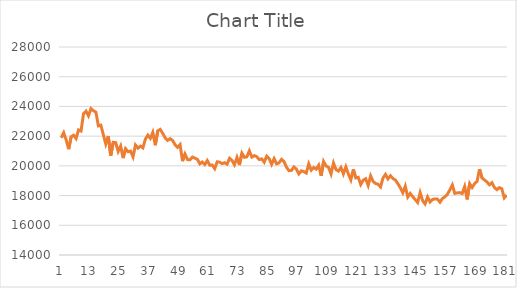
| Category | Series 0 |
|---|---|
| 0 | 21884.7 |
| 1 | 22230.5 |
| 2 | 21740.4 |
| 3 | 21124.3 |
| 4 | 21958.4 |
| 5 | 22063.1 |
| 6 | 21840 |
| 7 | 22419 |
| 8 | 22343.9 |
| 9 | 23511 |
| 10 | 23683.1 |
| 11 | 23364.8 |
| 12 | 23856 |
| 13 | 23709.1 |
| 14 | 23618.9 |
| 15 | 22693.4 |
| 16 | 22739.2 |
| 17 | 22104.9 |
| 18 | 21470.7 |
| 19 | 22006.4 |
| 20 | 20683.5 |
| 21 | 21583.3 |
| 22 | 21565 |
| 23 | 20970.9 |
| 24 | 21334.4 |
| 25 | 20523.7 |
| 26 | 21157.3 |
| 27 | 20947.8 |
| 28 | 20993.8 |
| 29 | 20603.6 |
| 30 | 21402.2 |
| 31 | 21191.8 |
| 32 | 21329.1 |
| 33 | 21211.8 |
| 34 | 21803 |
| 35 | 22071 |
| 36 | 21852.7 |
| 37 | 22255.4 |
| 38 | 21388.4 |
| 39 | 22359.1 |
| 40 | 22453.3 |
| 41 | 22187.4 |
| 42 | 21880.7 |
| 43 | 21718.1 |
| 44 | 21830.7 |
| 45 | 21706.2 |
| 46 | 21417 |
| 47 | 21249.1 |
| 48 | 21430.3 |
| 49 | 20316.7 |
| 50 | 20795.1 |
| 51 | 20423.2 |
| 52 | 20402.7 |
| 53 | 20591.7 |
| 54 | 20521.1 |
| 55 | 20439.3 |
| 56 | 20136.2 |
| 57 | 20261.7 |
| 58 | 20091.2 |
| 59 | 20357.7 |
| 60 | 20047.1 |
| 61 | 20052 |
| 62 | 19811.8 |
| 63 | 20271.5 |
| 64 | 20250 |
| 65 | 20151.5 |
| 66 | 20213.3 |
| 67 | 20110.1 |
| 68 | 20509.4 |
| 69 | 20365.7 |
| 70 | 20073.9 |
| 71 | 20570.3 |
| 72 | 20054.6 |
| 73 | 20855.9 |
| 74 | 20575.4 |
| 75 | 20607.1 |
| 76 | 21011 |
| 77 | 20590.5 |
| 78 | 20690.8 |
| 79 | 20614.6 |
| 80 | 20423 |
| 81 | 20470.3 |
| 82 | 20245.6 |
| 83 | 20646.8 |
| 84 | 20485.3 |
| 85 | 20099.9 |
| 86 | 20488.5 |
| 87 | 20138.9 |
| 88 | 20202.9 |
| 89 | 20437.8 |
| 90 | 20291.2 |
| 91 | 19913.1 |
| 92 | 19675.6 |
| 93 | 19689.9 |
| 94 | 19927.7 |
| 95 | 19779 |
| 96 | 19458.8 |
| 97 | 19667.3 |
| 98 | 19616.8 |
| 99 | 19517 |
| 100 | 20134.8 |
| 101 | 19712.7 |
| 102 | 19892.7 |
| 103 | 19779.5 |
| 104 | 20042.6 |
| 105 | 19329.7 |
| 106 | 20291.7 |
| 107 | 19991.1 |
| 108 | 19899.2 |
| 109 | 19456 |
| 110 | 20191.9 |
| 111 | 19751.7 |
| 112 | 19645.9 |
| 113 | 19888.2 |
| 114 | 19452.7 |
| 115 | 19931.8 |
| 116 | 19454.6 |
| 117 | 19055.2 |
| 118 | 19767.1 |
| 119 | 19187.8 |
| 120 | 19227.4 |
| 121 | 18744.8 |
| 122 | 19036.5 |
| 123 | 19135.7 |
| 124 | 18680.8 |
| 125 | 19325.8 |
| 126 | 18951.9 |
| 127 | 18813.8 |
| 128 | 18761.8 |
| 129 | 18580.4 |
| 130 | 19183.7 |
| 131 | 19424.2 |
| 132 | 19122.9 |
| 133 | 19334.8 |
| 134 | 19149.1 |
| 135 | 19047.5 |
| 136 | 18802.5 |
| 137 | 18527.7 |
| 138 | 18190.9 |
| 139 | 18630.6 |
| 140 | 17900.5 |
| 141 | 18140.8 |
| 142 | 17928.8 |
| 143 | 17730 |
| 144 | 17532 |
| 145 | 18199.8 |
| 146 | 17665.8 |
| 147 | 17438.2 |
| 148 | 17906.7 |
| 149 | 17565.7 |
| 150 | 17737 |
| 151 | 17776.8 |
| 152 | 17761.9 |
| 153 | 17552.1 |
| 154 | 17801.7 |
| 155 | 17915.1 |
| 156 | 18083.3 |
| 157 | 18379.8 |
| 158 | 18717.2 |
| 159 | 18146.2 |
| 160 | 18182.8 |
| 161 | 18198.5 |
| 162 | 18135.4 |
| 163 | 18611.2 |
| 164 | 17740.2 |
| 165 | 18806 |
| 166 | 18543.2 |
| 167 | 18800.8 |
| 168 | 18956.4 |
| 169 | 19777.7 |
| 170 | 19184.5 |
| 171 | 19051.4 |
| 172 | 18916.7 |
| 173 | 18726.6 |
| 174 | 18869.1 |
| 175 | 18546.5 |
| 176 | 18396.4 |
| 177 | 18532.8 |
| 178 | 18458.2 |
| 179 | 17847 |
| 180 | 18033.4 |